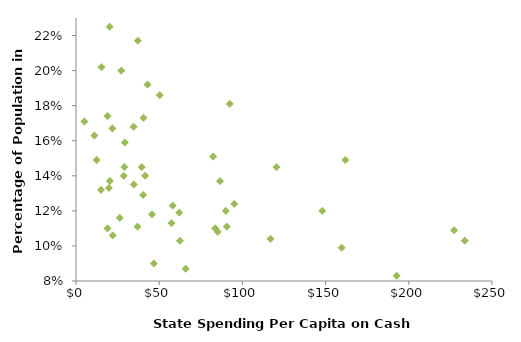
| Category | Series 0 |
|---|---|
| 21.818176552147598 | 0.167 |
| 227.25034415587947 | 0.109 |
| 15.318358186612066 | 0.202 |
| 5.027754189823317 | 0.171 |
| 161.9154920700363 | 0.149 |
| 22.081225548637747 | 0.106 |
| 57.40445151387066 | 0.113 |
| 41.49612908034467 | 0.14 |
| 12.44411303512632 | 0.149 |
| 11.086584121342247 | 0.163 |
| 36.97578583159907 | 0.111 |
| 40.360118501168635 | 0.129 |
| 19.78794664083244 | 0.133 |
| 26.293802586007217 | 0.116 |
| 85.23286185419697 | 0.108 |
| 15.01266259312077 | 0.132 |
| 27.20477237591561 | 0.2 |
| 42.93055624617607 | 0.192 |
| 58.10651493410384 | 0.123 |
| 233.63610327461782 | 0.103 |
| 62.06841835374724 | 0.119 |
| 39.51393858819587 | 0.145 |
| 147.96084407366274 | 0.12 |
| 20.255034171824285 | 0.225 |
| 20.36805378272719 | 0.137 |
| 29.10659843473721 | 0.145 |
| 18.951403145597897 | 0.11 |
| 18.921299893625257 | 0.174 |
| 46.775910700671496 | 0.09 |
| 90.61841559243895 | 0.111 |
| 37.159393407238426 | 0.217 |
| 120.4752785934364 | 0.145 |
| 50.314579724331495 | 0.186 |
| 159.61310103913087 | 0.099 |
| 86.5656054443216 | 0.137 |
| 28.709011241977805 | 0.14 |
| 82.46861057005418 | 0.151 |
| 95.10943531999598 | 0.124 |
| 34.80610283677489 | 0.135 |
| 29.32140748620006 | 0.159 |
| 62.446959734967336 | 0.103 |
| 92.44951260610796 | 0.181 |
| 34.67367316927852 | 0.168 |
| 192.63242225096454 | 0.083 |
| 65.91289915899334 | 0.087 |
| 116.85371358910368 | 0.104 |
| 89.93910267168488 | 0.12 |
| 40.57641034048355 | 0.173 |
| 83.72349445288316 | 0.11 |
| 45.69404350407958 | 0.118 |